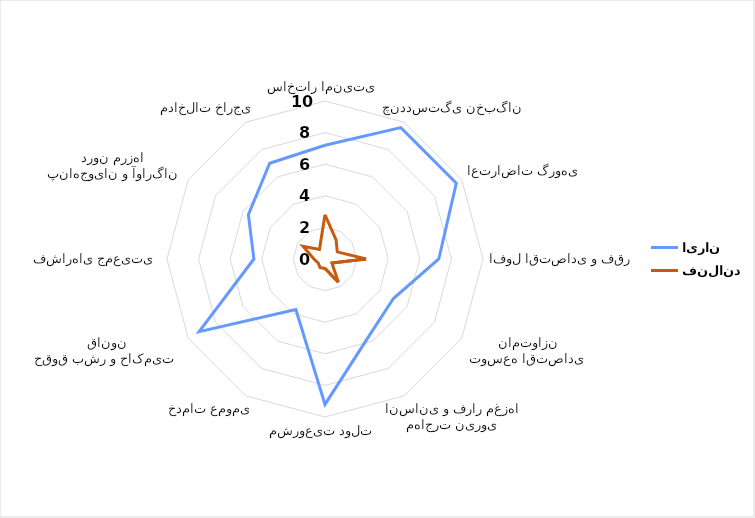
| Category | ایران | فنلاند |
|---|---|---|
| ساختار امنیتی | 7.2 | 2.8 |
| چنددستگی نخبگان | 9.6 | 1.4 |
| اعتراضات گروهی | 9.597 | 0.9 |
| افول اقتصادی و فقر | 7.2 | 2.6 |
| توسعه اقتصادی نامتوازن | 5 | 0.5 |
| مهاجرت نیروی انسانی و فرار مغزها | 5.6 | 1.7 |
| مشروعیت دولت | 9.2 | 0.6 |
| خدمات عمومی | 3.689 | 0.627 |
| حقوق بشر و حاکمیت قانون | 9.2 | 0.5 |
| فشارهای جمعیتی | 4.5 | 0.7 |
| پناهجویان و آوارگان درون مرزها | 5.6 | 1.6 |
| مداخلات خارجی | 7 | 0.7 |